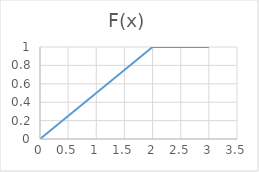
| Category | F(x) |
|---|---|
| 0.0 | 0 |
| 1.0 | 0.5 |
| 2.0 | 1 |
| 3.0 | 1 |